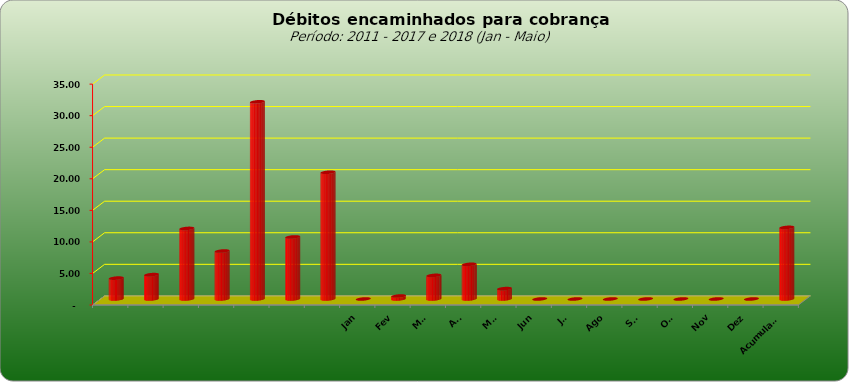
| Category |  3.309.443,02  |
|---|---|
|  | 3309443.02 |
|  | 3859728.44 |
|  | 11181928.25 |
|  | 7600526.01 |
|  | 31248623.5 |
|  | 9830198.34 |
|  | 20083556.95 |
| Jan | 0 |
| Fev | 468831.1 |
| Mar | 3741527.45 |
| Abr | 5493663.59 |
| Mai | 1643658.45 |
| Jun | 0 |
| Jul | 0 |
| Ago | 0 |
| Set | 0 |
| Out | 0 |
| Nov | 0 |
| Dez | 0 |
| Acumulado | 11347680.59 |